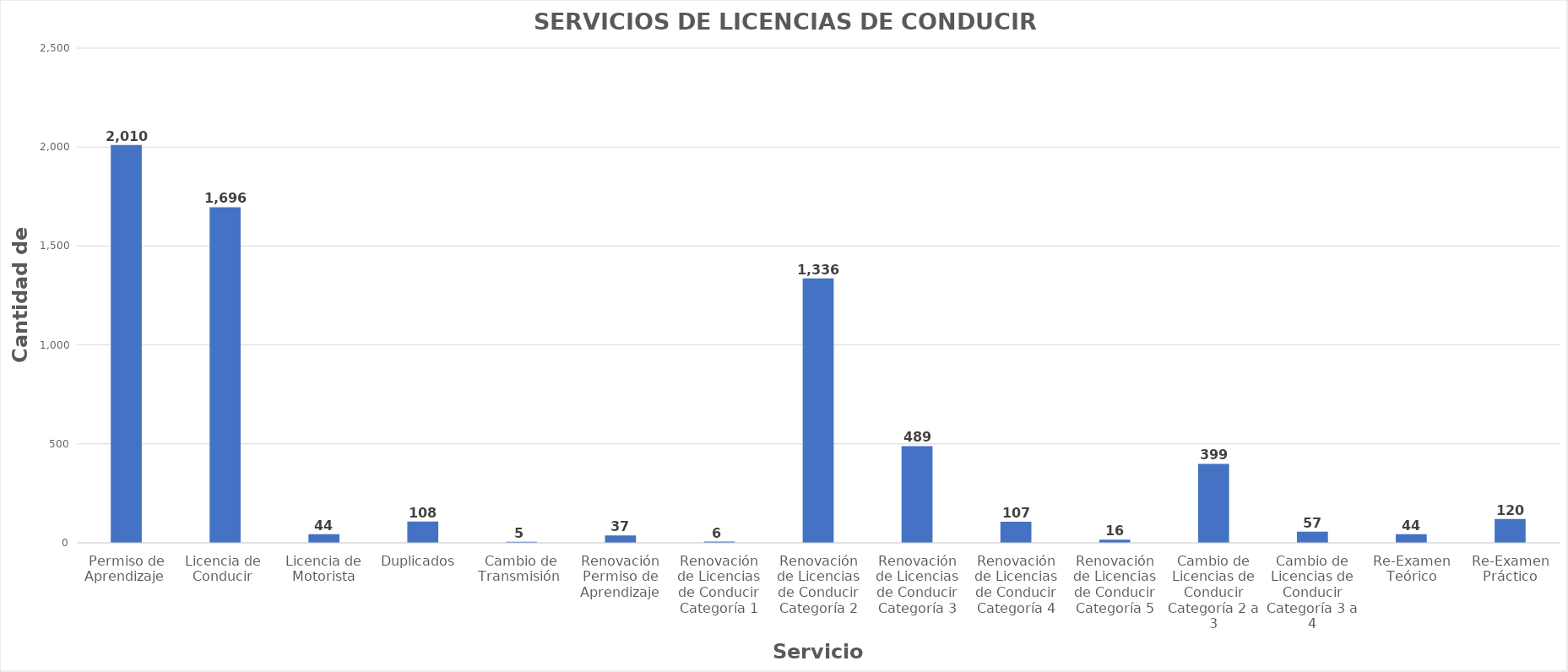
| Category | Series 0 |
|---|---|
| Permiso de Aprendizaje  | 2010 |
| Licencia de  Conducir  | 1696 |
| Licencia de Motorista | 44 |
| Duplicados  | 108 |
| Cambio de Transmisión  | 5 |
| Renovación Permiso de Aprendizaje | 37 |
| Renovación de Licencias de Conducir Categoría 1 | 6 |
| Renovación de Licencias de Conducir Categoría 2 | 1336 |
| Renovación de Licencias de Conducir Categoría 3 | 489 |
| Renovación de Licencias de Conducir Categoría 4 | 107 |
| Renovación de Licencias de Conducir Categoría 5 | 16 |
| Cambio de Licencias de Conducir Categoría 2 a 3 | 399 |
| Cambio de Licencias de Conducir Categoría 3 a 4 | 57 |
| Re-Examen Teórico | 44 |
| Re-Examen Práctico | 120 |